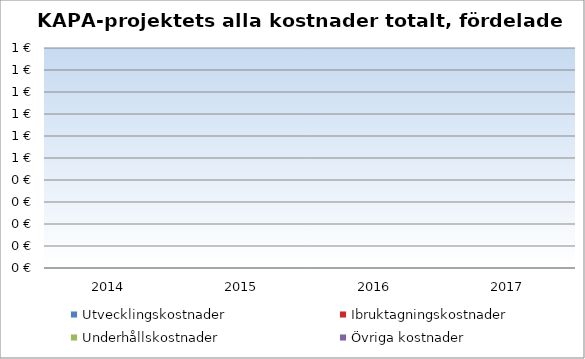
| Category | Utvecklingskostnader | Ibruktagningskostnader | Underhållskostnader | Övriga kostnader |
|---|---|---|---|---|
| 2014.0 | 0 | 0 | 0 | 0 |
| 2015.0 | 0 | 0 | 0 | 0 |
| 2016.0 | 0 | 0 | 0 | 0 |
| 2017.0 | 0 | 0 | 0 | 0 |